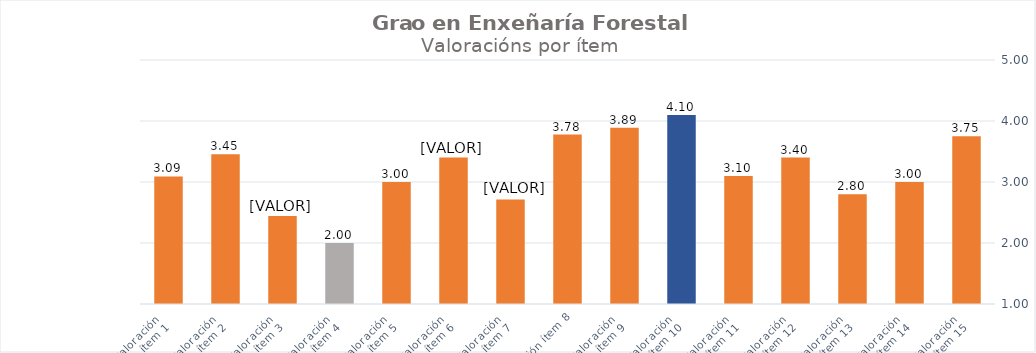
| Category | Series 0 |
|---|---|
| Valoración 
ítem 1 | 3.091 |
| Valoración 
ítem 2 | 3.455 |
| Valoración 
ítem 3 | 2.444 |
| Valoración 
ítem 4 | 2 |
| Valoración 
ítem 5 | 3 |
| Valoración 
ítem 6 | 3.4 |
| Valoración 
ítem 7 | 2.714 |
| Valoración ítem 8 | 3.778 |
| Valoración 
ítem 9 | 3.889 |
| Valoración 
ítem 10 | 4.1 |
| Valoración 
ítem 11 | 3.1 |
| Valoración 
ítem 12 | 3.4 |
| Valoración 
ítem 13 | 2.8 |
| Valoración 
ítem 14 | 3 |
| Valoración 
ítem 15 | 3.75 |